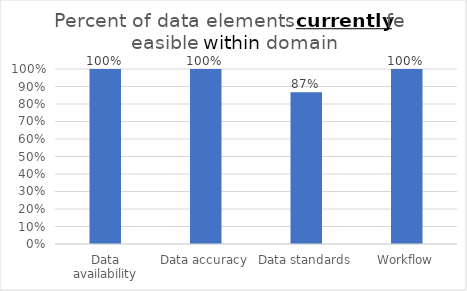
| Category | Percent of data elements currently feasible within domain |
|---|---|
| Data availability | 1 |
| Data accuracy | 1 |
| Data standards | 0.867 |
| Workflow | 1 |